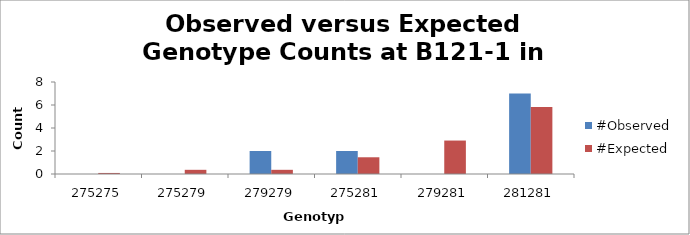
| Category | #Observed | #Expected |
|---|---|---|
| 275275.0 | 0 | 0.091 |
| 275279.0 | 0 | 0.364 |
| 279279.0 | 2 | 0.364 |
| 275281.0 | 2 | 1.455 |
| 279281.0 | 0 | 2.909 |
| 281281.0 | 7 | 5.818 |